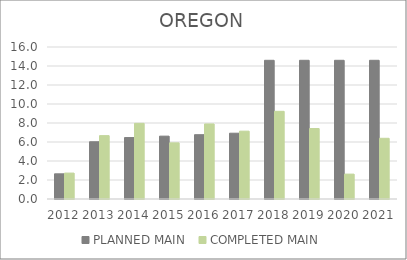
| Category | PLANNED MAIN  | COMPLETED MAIN |
|---|---|---|
| 2012.0 | 2.65 | 2.727 |
| 2013.0 | 6.026 | 6.67 |
| 2014.0 | 6.468 | 7.963 |
| 2015.0 | 6.617 | 5.91 |
| 2016.0 | 6.769 | 7.9 |
| 2017.0 | 6.925 | 7.14 |
| 2018.0 | 14.6 | 9.23 |
| 2019.0 | 14.6 | 7.42 |
| 2020.0 | 14.6 | 2.62 |
| 2021.0 | 14.6 | 6.39 |